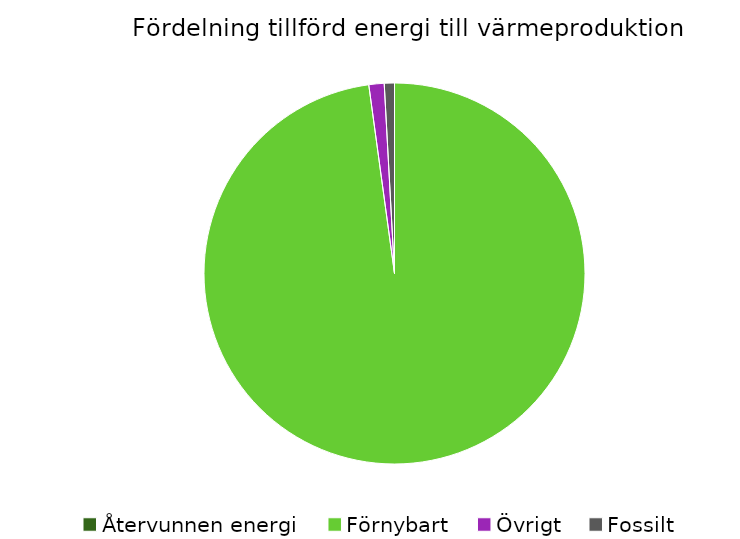
| Category | Fördelning värmeproduktion |
|---|---|
| Återvunnen energi | 0 |
| Förnybart | 0.978 |
| Övrigt | 0.013 |
| Fossilt | 0.009 |